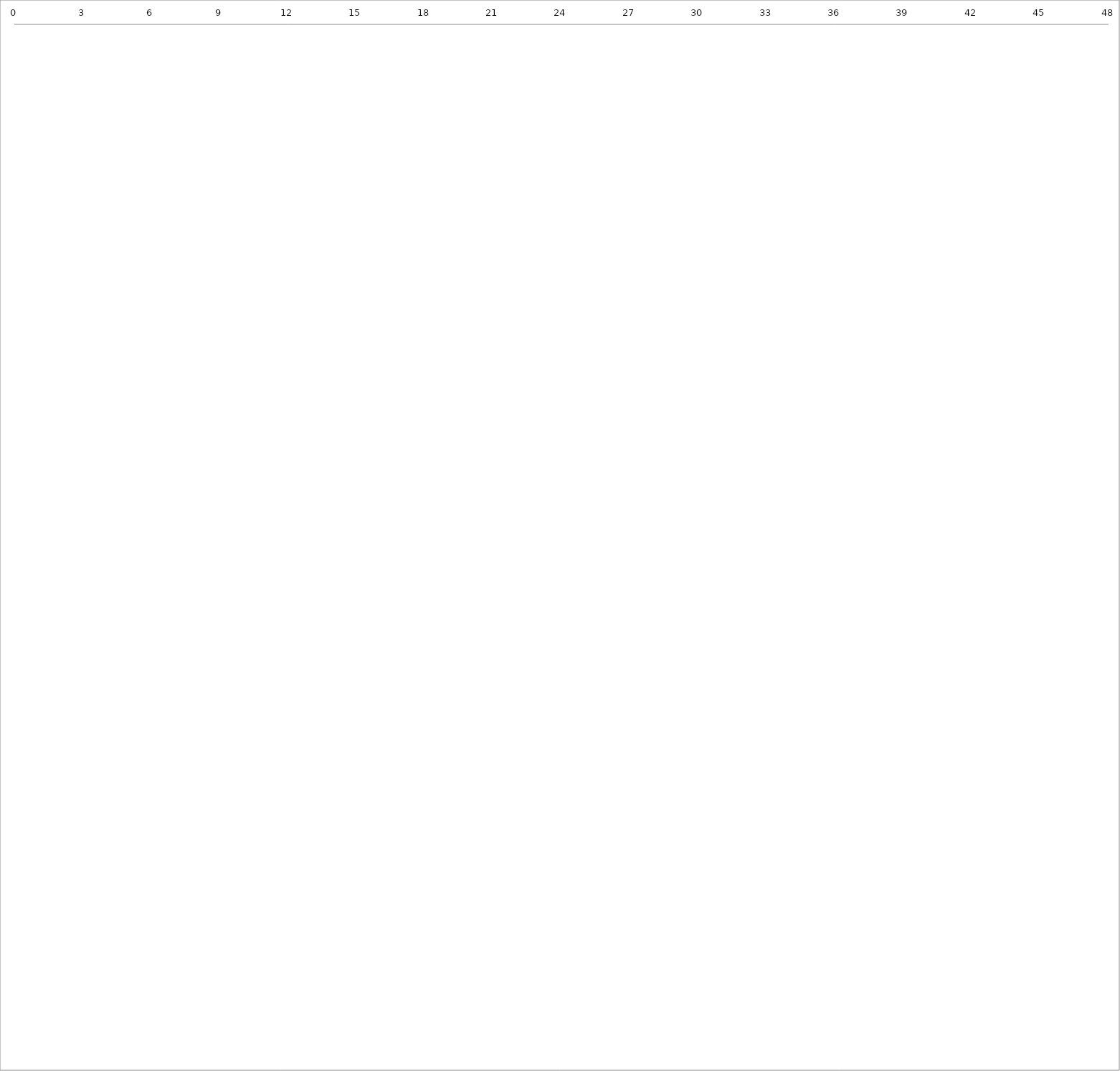
| Category | Začiatok | Duration |
|---|---|---|
| 0.0 | 0 | 0 |
| 0.0 | 0 | 0 |
| 0.0 | 0 | 0 |
| 0.0 | 0 | 0 |
| 0.0 | 0 | 0 |
| 0.0 | 0 | 0 |
| 0.0 | 0 | 0 |
| 0.0 | 0 | 0 |
| 0.0 | 0 | 0 |
| 0.0 | 0 | 0 |
| 0.0 | 0 | 0 |
| 0.0 | 0 | 0 |
| 0.0 | 0 | 0 |
| 0.0 | 0 | 0 |
| 0.0 | 0 | 0 |
| 0.0 | 0 | 0 |
| 0.0 | 0 | 0 |
| 0.0 | 0 | 0 |
| 0.0 | 0 | 0 |
| 0.0 | 0 | 0 |
| 0.0 | 0 | 0 |
| 0.0 | 0 | 0 |
| 0.0 | 0 | 0 |
| 0.0 | 0 | 0 |
| 0.0 | 0 | 0 |
| 0.0 | 0 | 0 |
| 0.0 | 0 | 0 |
| 0.0 | 0 | 0 |
| 0.0 | 0 | 0 |
| 0.0 | 0 | 0 |
| 0.0 | 0 | 0 |
| 0.0 | 0 | 0 |
| 0.0 | 0 | 0 |
| 0.0 | 0 | 0 |
| 0.0 | 0 | 0 |
| 0.0 | 0 | 0 |
| 0.0 | 0 | 0 |
| 0.0 | 0 | 0 |
| 0.0 | 0 | 0 |